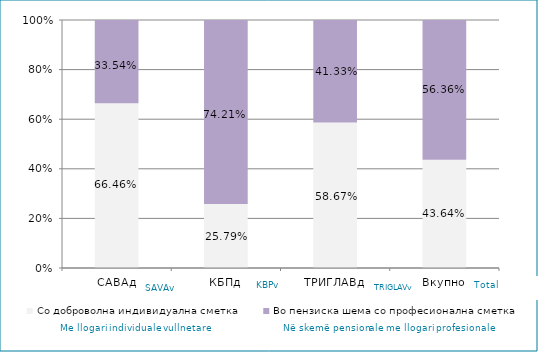
| Category | Со доброволна индивидуална сметка  | Во пензиска шема со професионална сметка |
|---|---|---|
| САВАд | 0.665 | 0.335 |
| КБПд | 0.258 | 0.742 |
| ТРИГЛАВд | 0.587 | 0.413 |
| Вкупно | 0.436 | 0.564 |